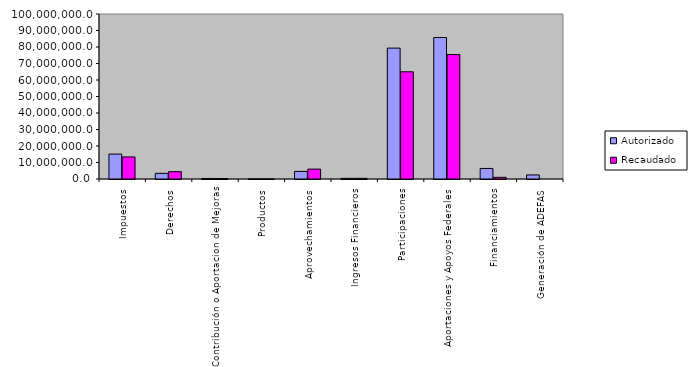
| Category | Autorizado | Recaudado |
|---|---|---|
| Impuestos | 15097540.3 | 13365299.9 |
| Derechos | 3446355.3 | 4445588.3 |
| Contribución o Aportacion de Mejoras | 325649.7 | 261956.2 |
| Productos | 48901.3 | 23784.9 |
| Aprovechamientos | 4590930.7 | 5989359.2 |
| Ingresos Financieros | 390000 | 399942.5 |
| Participaciones | 79323006.5 | 64970176.3 |
| Aportaciones y Apoyos Federales | 85731992.1 | 75380898.8 |
| Financiamientos | 6400000 | 1000000 |
| Generación de ADEFAS | 2460661.3 | 0 |